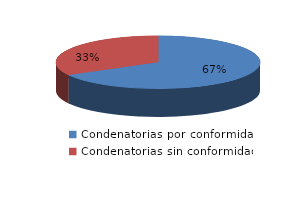
| Category | Series 0 |
|---|---|
| 0 | 83 |
| 1 | 41 |